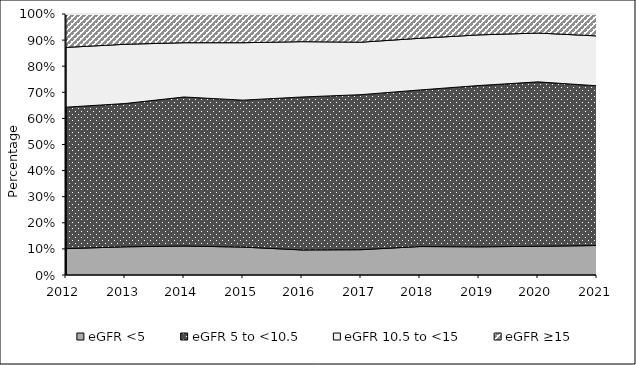
| Category | eGFR <5 | eGFR 5 to <10.5 | eGFR 10.5 to <15 | eGFR ≥15 |
|---|---|---|---|---|
| 2012.0 | 10.1 | 54.2 | 22.9 | 12.8 |
| 2013.0 | 10.8 | 54.9 | 22.7 | 11.6 |
| 2014.0 | 11.1 | 57.1 | 20.8 | 11 |
| 2015.0 | 10.7 | 56.3 | 22 | 11 |
| 2016.0 | 9.6 | 58.6 | 21.2 | 10.6 |
| 2017.0 | 9.7 | 59.4 | 20.1 | 10.7 |
| 2018.0 | 10.9 | 60 | 19.8 | 9.3 |
| 2019.0 | 10.8 | 61.8 | 19.4 | 8 |
| 2020.0 | 11 | 63 | 18.7 | 7.3 |
| 2021.0 | 11.3 | 61.2 | 19.1 | 8.5 |